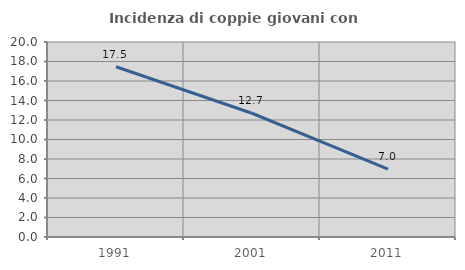
| Category | Incidenza di coppie giovani con figli |
|---|---|
| 1991.0 | 17.464 |
| 2001.0 | 12.691 |
| 2011.0 | 6.971 |